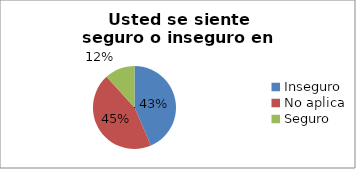
| Category | Series 0 |
|---|---|
| Inseguro | 0.435 |
| No aplica | 0.447 |
| Seguro | 0.118 |